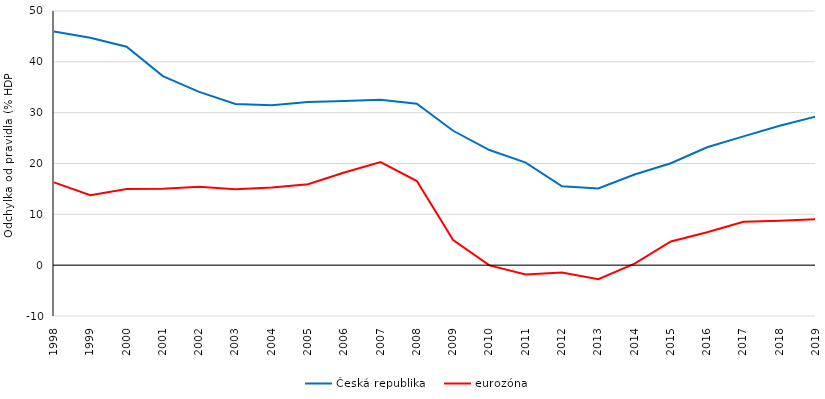
| Category | Česká republika | eurozóna |
|---|---|---|
| 1998.0 | 45.978 | 16.29 |
| 1999.0 | 44.745 | 13.752 |
| 2000.0 | 42.961 | 15 |
| 2001.0 | 37.198 | 15.011 |
| 2002.0 | 34.078 | 15.404 |
| 2003.0 | 31.7 | 14.922 |
| 2004.0 | 31.469 | 15.27 |
| 2005.0 | 32.119 | 15.909 |
| 2006.0 | 32.297 | 18.225 |
| 2007.0 | 32.535 | 20.296 |
| 2008.0 | 31.75 | 16.556 |
| 2009.0 | 26.44 | 4.943 |
| 2010.0 | 22.645 | -0.043 |
| 2011.0 | 20.174 | -1.849 |
| 2012.0 | 15.53 | -1.456 |
| 2013.0 | 15.091 | -2.776 |
| 2014.0 | 17.831 | 0.309 |
| 2015.0 | 20.045 | 4.658 |
| 2016.0 | 23.189 | 6.471 |
| 2017.0 | 25.334 | 8.531 |
| 2018.0 | 27.416 | 8.739 |
| 2019.0 | 29.24 | 9.044 |